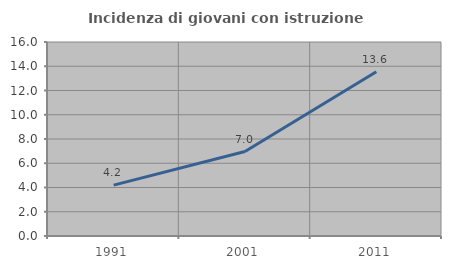
| Category | Incidenza di giovani con istruzione universitaria |
|---|---|
| 1991.0 | 4.194 |
| 2001.0 | 6.967 |
| 2011.0 | 13.552 |